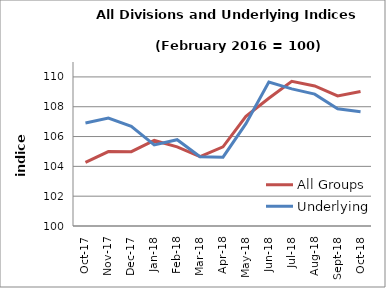
| Category | All Groups | Underlying |
|---|---|---|
| 2017-10-01 | 104.27 | 106.905 |
| 2017-11-01 | 104.991 | 107.237 |
| 2017-12-01 | 104.983 | 106.688 |
| 2018-01-01 | 105.739 | 105.443 |
| 2018-02-01 | 105.308 | 105.79 |
| 2018-03-01 | 104.655 | 104.651 |
| 2018-04-01 | 105.309 | 104.614 |
| 2018-05-01 | 107.355 | 106.863 |
| 2018-06-01 | 108.567 | 109.659 |
| 2018-07-01 | 109.702 | 109.198 |
| 2018-08-01 | 109.392 | 108.845 |
| 2018-09-01 | 108.722 | 107.857 |
| 2018-10-01 | 109.022 | 107.664 |